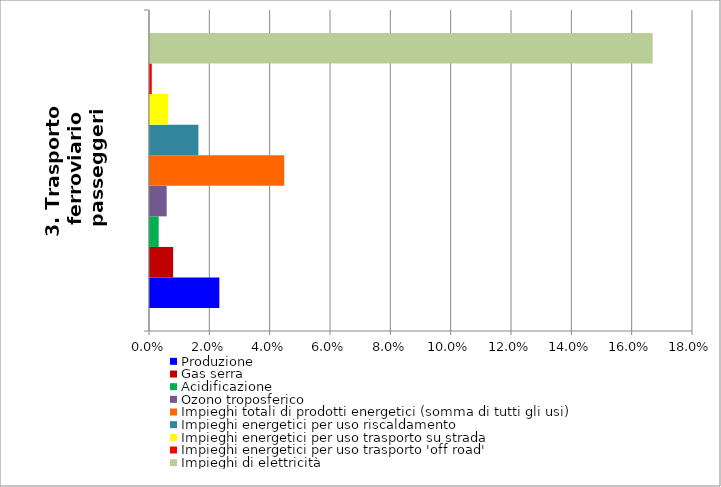
| Category | Produzione | Gas serra | Acidificazione | Ozono troposferico | Impieghi totali di prodotti energetici (somma di tutti gli usi) | Impieghi energetici per uso riscaldamento | Impieghi energetici per uso trasporto su strada | Impieghi energetici per uso trasporto 'off road' | Impieghi di elettricità |
|---|---|---|---|---|---|---|---|---|---|
| 3. Trasporto  ferroviario passeggeri | 0.023 | 0.008 | 0.003 | 0.006 | 0.045 | 0.016 | 0.006 | 0.001 | 0.167 |